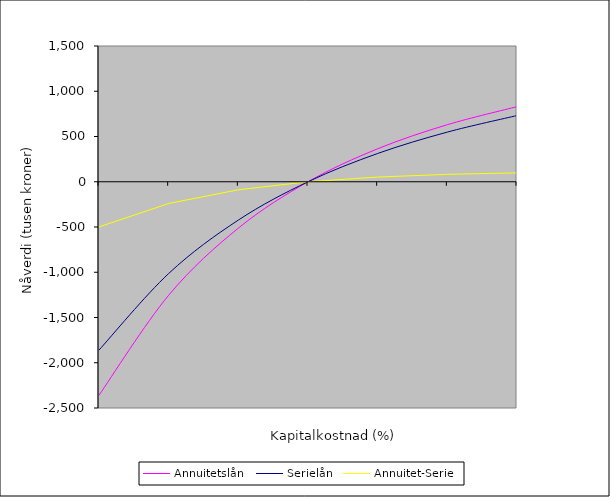
| Category | Annuitetslån | Serielån | Annuitet-Serie |
|---|---|---|---|
| nan | -2358.935 | -1860 | -498.935 |
| 2.0 | -1254.156 | -1013.806 | -240.35 |
| 4.0 | -512.495 | -423.599 | -88.896 |
| 6.0 | 0 | 0 | 0 |
| 8.0 | 364.269 | 312.37 | 51.898 |
| 10.0 | 630.29 | 548.616 | 81.674 |
| 12.0 | 829.599 | 731.494 | 98.105 |